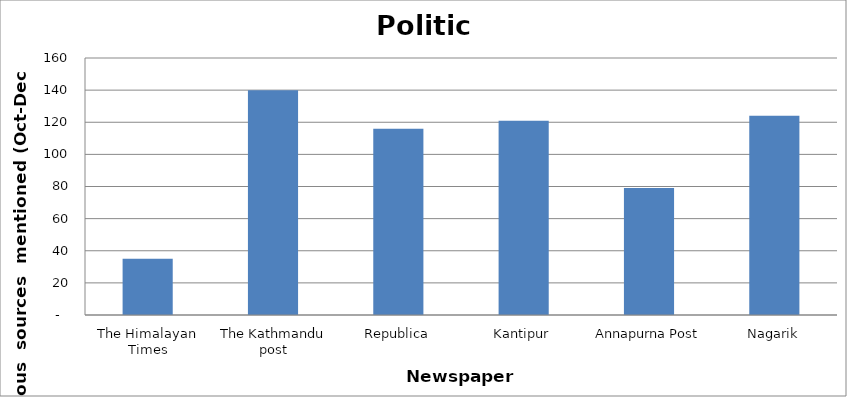
| Category | Politics |
|---|---|
| The Himalayan Times | 35 |
| The Kathmandu post | 140 |
| Republica | 116 |
| Kantipur | 121 |
| Annapurna Post | 79 |
| Nagarik | 124 |